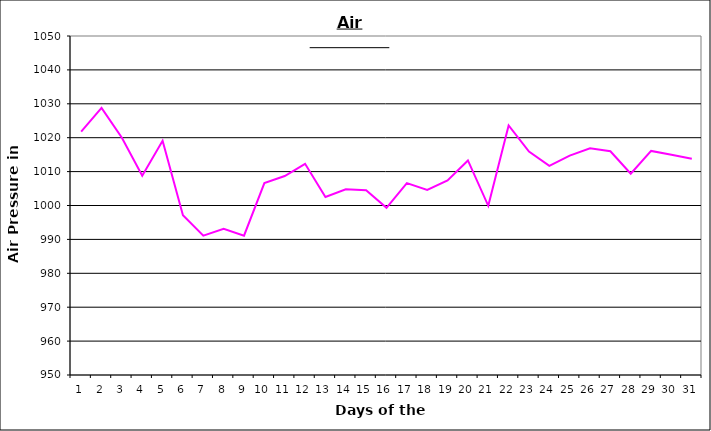
| Category | Series 0 |
|---|---|
| 0 | 1021.8 |
| 1 | 1028.8 |
| 2 | 1020 |
| 3 | 1008.8 |
| 4 | 1019.1 |
| 5 | 997.1 |
| 6 | 991.1 |
| 7 | 993.1 |
| 8 | 991.1 |
| 9 | 1006.6 |
| 10 | 1008.7 |
| 11 | 1012.3 |
| 12 | 1002.5 |
| 13 | 1004.8 |
| 14 | 1004.5 |
| 15 | 999.3 |
| 16 | 1006.6 |
| 17 | 1004.6 |
| 18 | 1007.4 |
| 19 | 1013.3 |
| 20 | 999.9 |
| 21 | 1023.6 |
| 22 | 1015.9 |
| 23 | 1011.7 |
| 24 | 1014.7 |
| 25 | 1016.9 |
| 26 | 1016 |
| 27 | 1009.4 |
| 28 | 1016.1 |
| 29 | 1015 |
| 30 | 1013.8 |